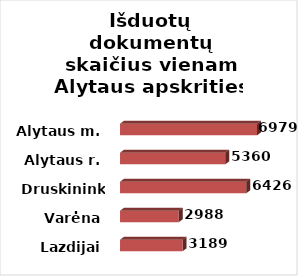
| Category | Series 0 |
|---|---|
| Lazdijai | 3189 |
| Varėna | 2988 |
| Druskininkai | 6426 |
| Alytaus r. | 5360 |
| Alytaus m. | 6979 |